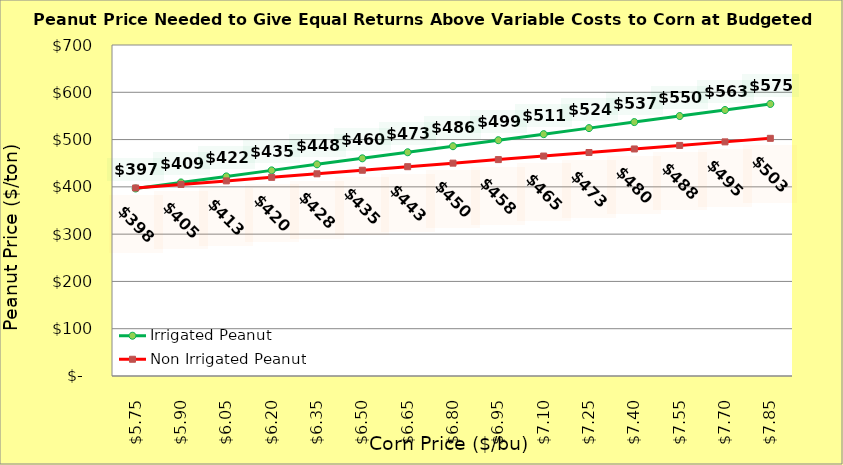
| Category | Irrigated Peanut | Non Irrigated Peanut |
|---|---|---|
| 5.749999999999997 | 396.565 | 397.637 |
| 5.899999999999998 | 409.331 | 405.137 |
| 6.049999999999998 | 422.097 | 412.637 |
| 6.199999999999998 | 434.863 | 420.137 |
| 6.349999999999999 | 447.629 | 427.637 |
| 6.499999999999999 | 460.395 | 435.137 |
| 6.6499999999999995 | 473.161 | 442.637 |
| 6.8 | 485.927 | 450.137 |
| 6.95 | 498.693 | 457.637 |
| 7.1000000000000005 | 511.459 | 465.137 |
| 7.250000000000001 | 524.225 | 472.637 |
| 7.400000000000001 | 536.991 | 480.137 |
| 7.550000000000002 | 549.757 | 487.637 |
| 7.700000000000002 | 562.523 | 495.137 |
| 7.850000000000002 | 575.289 | 502.637 |